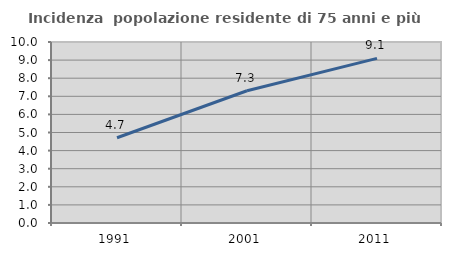
| Category | Incidenza  popolazione residente di 75 anni e più |
|---|---|
| 1991.0 | 4.708 |
| 2001.0 | 7.308 |
| 2011.0 | 9.095 |